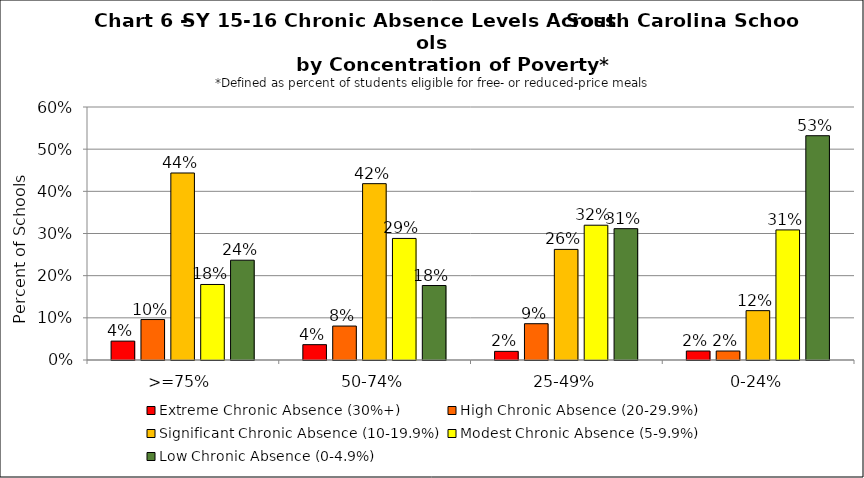
| Category | Extreme Chronic Absence (30%+) | High Chronic Absence (20-29.9%) | Significant Chronic Absence (10-19.9%) | Modest Chronic Absence (5-9.9%) | Low Chronic Absence (0-4.9%) |
|---|---|---|---|---|---|
| 0 | 0.045 | 0.096 | 0.443 | 0.179 | 0.237 |
| 1 | 0.036 | 0.081 | 0.418 | 0.288 | 0.177 |
| 2 | 0.02 | 0.086 | 0.262 | 0.32 | 0.311 |
| 3 | 0.021 | 0.021 | 0.117 | 0.309 | 0.532 |